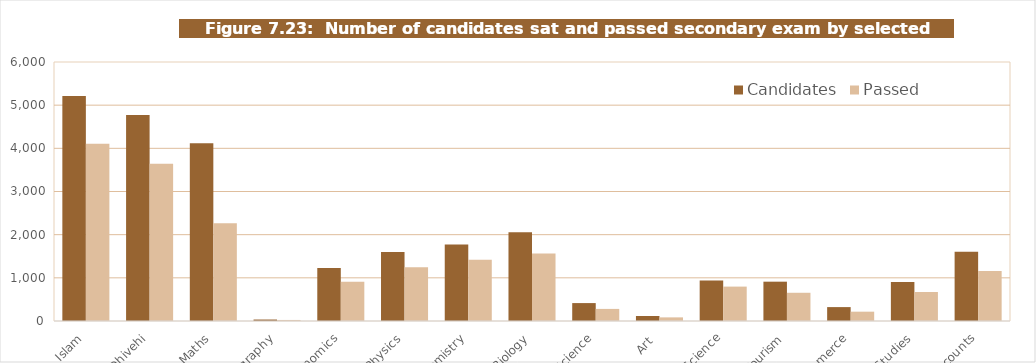
| Category | Candidates | Passed |
|---|---|---|
| Islam | 5215 | 4109 |
| Dhivehi | 4772 | 3643 |
| Maths | 4120 | 2262 |
| Geography | 34 | 24 |
| Economics | 1229 | 912 |
| Physics | 1599 | 1247 |
| Chemistry | 1771 | 1420 |
| Biology | 2054 | 1563 |
| Marine Science | 415 | 280 |
| Art  | 116 | 84 |
| Computer Science | 938 | 797 |
| Travel and Tourism | 911 | 654 |
| Commerce | 322 | 216 |
| Business Studies | 906 | 672 |
| Accounts | 1607 | 1156 |